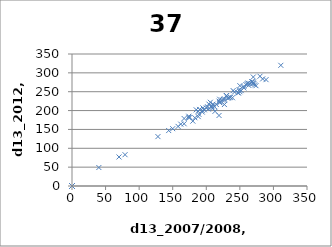
| Category | Series 0 |
|---|---|
| 230.0 | 240 |
| 195.0 | 207 |
| 261.0 | 271 |
| 215.0 | 216 |
| 158.0 | 158 |
| 208.0 | 210 |
| 185.0 | 202 |
| 250.0 | 250 |
| 167.0 | 165 |
| 240.0 | 253 |
| 174.0 | 185 |
| 188.0 | 198 |
| 144.0 | 147 |
| 230.0 | 239 |
| 206.0 | 222 |
| 227.0 | 228 |
| 270.0 | 289 |
| 250.0 | 266 |
| 259.0 | 269 |
| 239.0 | 234 |
| 213.0 | 198 |
| 128.0 | 131 |
| 263.0 | 267 |
| 197.0 | 202 |
| 210.0 | 217 |
| 150.0 | 152 |
| 232.0 | 233 |
| 189.0 | 190 |
| 212.0 | 211 |
| 269.0 | 271 |
| 180.0 | 172 |
| 220.0 | 230 |
| 262.0 | 273 |
| 265.0 | 272 |
| 280.0 | 291 |
| 221.0 | 223 |
| 248.0 | 247 |
| 190.0 | 203 |
| 220.0 | 221 |
| 227.0 | 216 |
| 174.0 | 182 |
| 200.0 | 207 |
| 203.0 | 204 |
| 204.0 | 217 |
| 311.0 | 320 |
| 247.0 | 247 |
| 272.0 | 268 |
| 194.0 | 196 |
| 268.0 | 277 |
| 242.0 | 249 |
| 271.0 | 272 |
| 268.0 | 276 |
| 183.0 | 181 |
| 209.0 | 212 |
| 274.0 | 266 |
| 252.0 | 253 |
| 227.0 | 231 |
| 224.0 | 228 |
| 249.0 | 255 |
| 256.0 | 264 |
| 194.0 | 200 |
| 256.0 | 260 |
| 234.0 | 234 |
| 202.0 | 210 |
| 219.0 | 187 |
| 188.0 | 184 |
| 236.0 | 235 |
| 284.0 | 284 |
| 162.0 | 164 |
| 289.0 | 282 |
| 175.0 | 181 |
| 219.0 | 225 |
| 167.0 | 179 |
| 270.0 | 275 |
| 209.0 | 206 |
| 79.0 | 83 |
| 40.0 | 49 |
| 70.0 | 77 |
| 0.0 | 0 |
| 0.0 | 0 |
| 0.0 | 0 |
| 0.0 | 0 |
| 0.0 | 0 |
| 0.0 | 0 |